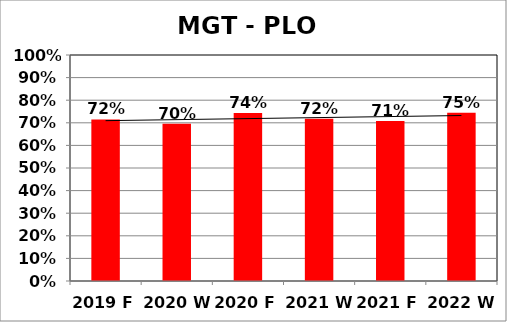
| Category | Series 0 |
|---|---|
| 2019 F | 0.715 |
| 2020 W | 0.696 |
| 2020 F | 0.743 |
| 2021 W | 0.718 |
| 2021 F | 0.707 |
| 2022 W | 0.745 |